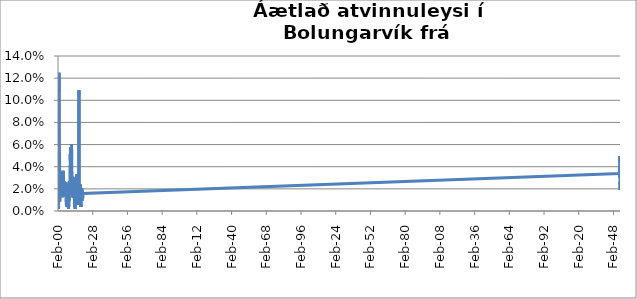
| Category | Series 0 |
|---|---|
| 2000-02-01 | 0.007 |
| 2000-03-01 | 0.009 |
| 2000-04-01 | 0.007 |
| 2000-05-01 | 0.003 |
| 2000-06-01 | 0.003 |
| 2000-07-01 | 0.002 |
| 2000-08-01 | 0.007 |
| 2000-09-01 | 0.012 |
| 2000-10-01 | 0.023 |
| 2000-11-01 | 0.024 |
| 2000-12-01 | 0.125 |
| 2001-01-01 | 0.108 |
| 2001-02-01 | 0.075 |
| 2001-03-01 | 0.054 |
| 2001-04-01 | 0.054 |
| 2001-05-01 | 0.052 |
| 2001-06-01 | 0.021 |
| 2001-07-01 | 0.009 |
| 2001-08-01 | 0.017 |
| 2001-09-01 | 0.017 |
| 2001-10-01 | 0.017 |
| 2001-11-01 | 0.014 |
| 2001-12-01 | 0.014 |
| 2002-01-01 | 0.014 |
| 2002-02-01 | 0.013 |
| 2002-03-01 | 0.014 |
| 2002-04-01 | 0.016 |
| 2002-05-01 | 0.023 |
| 2002-06-01 | 0.016 |
| 2002-07-01 | 0.014 |
| 2002-08-01 | 0.014 |
| 2002-09-01 | 0.018 |
| 2002-10-01 | 0.02 |
| 2002-11-01 | 0.022 |
| 2002-12-01 | 0.031 |
| 2003-01-01 | 0.03 |
| 2003-02-01 | 0.03 |
| 2003-03-01 | 0.025 |
| 2003-04-01 | 0.022 |
| 2003-05-01 | 0.02 |
| 2003-06-01 | 0.02 |
| 2003-07-01 | 0.021 |
| 2003-08-01 | 0.012 |
| 2003-09-01 | 0.028 |
| 2003-10-01 | 0.032 |
| 2003-11-01 | 0.036 |
| 2003-12-01 | 0.028 |
| 2004-01-01 | 0.031 |
| 2004-02-01 | 0.021 |
| 2004-03-01 | 0.036 |
| 2004-04-01 | 0.032 |
| 2004-05-01 | 0.026 |
| 2004-06-01 | 0.034 |
| 2004-07-01 | 0.032 |
| 2004-08-01 | 0.026 |
| 2004-09-01 | 0.021 |
| 2004-10-01 | 0.023 |
| 2004-11-01 | 0.027 |
| 2004-12-01 | 0.017 |
| 2005-01-01 | 0.025 |
| 2005-02-01 | 0.025 |
| 2005-03-01 | 0.019 |
| 2005-04-01 | 0.023 |
| 2005-05-01 | 0.023 |
| 2005-06-01 | 0.015 |
| 2005-07-01 | 0.013 |
| 2005-08-01 | 0.021 |
| 2005-09-01 | 0.022 |
| 2005-10-01 | 0.019 |
| 2005-11-01 | 0.02 |
| 2005-12-01 | 0.018 |
| 2006-01-01 | 0.016 |
| 2006-02-01 | 0.014 |
| 2006-03-01 | 0.018 |
| 2006-04-01 | 0.021 |
| 2006-05-01 | 0.026 |
| 2006-06-01 | 0.019 |
| 2006-07-01 | 0.019 |
| 2006-08-01 | 0.011 |
| 2006-09-01 | 0.007 |
| 2006-10-01 | 0.008 |
| 2006-11-01 | 0.006 |
| 2006-12-01 | 0.006 |
| 2007-01-01 | 0.004 |
| 2007-02-01 | 0.004 |
| 2007-03-01 | 0.012 |
| 2007-04-01 | 0.009 |
| 2007-05-01 | 0.013 |
| 2007-06-01 | 0.008 |
| 2007-07-01 | 0.006 |
| 2007-08-01 | 0.025 |
| 2007-09-01 | 0.017 |
| 2007-10-01 | 0.024 |
| 2007-11-01 | 0.02 |
| 2007-12-01 | 0.014 |
| 2008-01-01 | 0.004 |
| 2008-02-01 | 0.004 |
| 2008-03-01 | 0.012 |
| 2008-04-01 | 0.009 |
| 2008-05-01 | 0.004 |
| 2008-06-01 | 0.004 |
| 2008-07-01 | 0.002 |
| 2008-08-01 | 0.004 |
| 2008-09-01 | 0.006 |
| 2008-10-01 | 0.004 |
| 2008-11-01 | 0.006 |
| 2008-12-01 | 0.009 |
| 2009-01-01 | 0.012 |
| 2009-02-01 | 0.01 |
| 2009-03-01 | 0.019 |
| 2009-04-01 | 0.027 |
| 2009-05-01 | 0.023 |
| 2009-06-01 | 0.018 |
| 2009-07-01 | 0.018 |
| 2009-08-01 | 0.016 |
| 2009-09-01 | 0.023 |
| 2009-10-01 | 0.029 |
| 2009-11-01 | 0.038 |
| 2009-12-01 | 0.047 |
| 2010-01-01 | 0.051 |
| 2010-02-01 | 0.044 |
| 2010-03-01 | 0.046 |
| 2010-04-01 | 0.056 |
| 2010-05-01 | 0.058 |
| 2010-06-01 | 0.044 |
| 2010-07-01 | 0.041 |
| 2010-08-01 | 0.037 |
| 2010-09-01 | 0.035 |
| 2010-10-01 | 0.029 |
| 2010-11-01 | 0.032 |
| 2010-12-01 | 0.06 |
| 2011-01-01 | 0.059 |
| 2011-02-01 | 0.055 |
| 2011-03-01 | 0.053 |
| 2011-04-01 | 0.043 |
| 2011-05-01 | 0.022 |
| 2011-06-01 | 0.02 |
| 2011-07-01 | 0.018 |
| 2011-08-01 | 0.022 |
| 2011-09-01 | 0.014 |
| 2011-10-01 | 0.013 |
| 2011-11-01 | 0.017 |
| 2011-12-01 | 0.027 |
| 2012-01-01 | 0.027 |
| 2012-02-01 | 0.027 |
| 2012-03-01 | 0.031 |
| 2012-04-01 | 0.028 |
| 2012-05-01 | 0.016 |
| 2012-06-01 | 0.012 |
| 2012-07-01 | 0.012 |
| 2012-08-01 | 0.012 |
| 2012-09-01 | 0.019 |
| 2012-10-01 | 0.03 |
| 2012-11-01 | 0.028 |
| 2012-12-01 | 0.026 |
| 2013-01-01 | 0.024 |
| 2013-02-01 | 0.02 |
| 2013-03-01 | 0.018 |
| 2013-04-01 | 0.011 |
| 2013-05-01 | 0.009 |
| 2013-06-01 | 0.006 |
| 2013-07-01 | 0.007 |
| 2013-08-01 | 0.007 |
| 2013-09-01 | 0.004 |
| 2013-10-01 | 0.004 |
| 2013-11-01 | 0.004 |
| 2013-12-01 | 0.002 |
| 2014-01-01 | 0.006 |
| 2014-02-01 | 0.01 |
| 2014-03-01 | 0.014 |
| 2014-04-01 | 0.014 |
| 2014-05-01 | 0.018 |
| 2014-06-01 | 0.016 |
| 2014-07-01 | 0.012 |
| 2014-08-01 | 0.006 |
| 2014-09-01 | 0.012 |
| 2014-10-01 | 0.016 |
| 2014-11-01 | 0.02 |
| 2014-12-01 | 0.021 |
| 2015-01-01 | 0.025 |
| 2015-02-01 | 0.033 |
| 2015-03-01 | 0.033 |
| 2015-04-01 | 0.032 |
| 2015-05-01 | 0.026 |
| 2015-06-01 | 0.023 |
| 2015-07-01 | 0.019 |
| 2015-08-01 | 0.017 |
| 2015-09-01 | 0.011 |
| 2015-10-01 | 0.012 |
| 2015-11-01 | 0.01 |
| 2015-12-01 | 0.012 |
| 2016-01-01 | 0.012 |
| 2016-02-01 | 0.017 |
| 2016-03-01 | 0.019 |
| 2016-04-01 | 0.023 |
| 2016-05-01 | 0.027 |
| 2016-06-01 | 0.013 |
| 2016-07-01 | 0.011 |
| 2016-08-01 | 0.007 |
| 2016-09-01 | 0.009 |
| 2016-10-01 | 0.006 |
| 2016-11-01 | 0.023 |
| 2016-12-01 | 0.096 |
| 2017-01-01 | 0.109 |
| 2017-02-01 | 0.023 |
| 2017-03-01 | 0.017 |
| 2017-04-01 | 0.015 |
| 2017-05-01 | 0.009 |
| 2017-06-01 | 0.009 |
| 2017-07-01 | 0.007 |
| 2017-08-01 | 0.02 |
| 2017-09-01 | 0.016 |
| 2017-10-01 | 0.017 |
| 2017-11-01 | 0.017 |
| 2017-12-01 | 0.015 |
| 2018-01-01 | 0.019 |
| 2018-02-01 | 0.024 |
| 2018-03-01 | 0.024 |
| 2018-04-01 | 0.018 |
| 2018-05-01 | 0.011 |
| 2018-06-01 | 0.007 |
| 2018-07-01 | 0.004 |
| 2018-08-01 | 0.006 |
| 2018-09-01 | 0.004 |
| 2018-10-01 | 0.013 |
| 2018-11-01 | 0.013 |
| 2018-12-01 | 0.013 |
| 2019-01-01 | 0.013 |
| 2019-02-01 | 0.019 |
| 2019-03-01 | 0.017 |
| 2019-04-01 | 0.02 |
| 2019-05-01 | 0.015 |
| 2019-06-01 | 0.013 |
| 2019-07-01 | 0.013 |
| 2019-08-01 | 0.009 |
| 2019-09-01 | 0.013 |
| 2019-10-01 | 0.013 |
| 2019-11-01 | 0.019 |
| 2019-12-01 | 0.013 |
| 2020-01-01 | 0.012 |
| 2020-02-01 | 0.016 |
| 202003.0 | 0.034 |
| 202004.0 | 0.04 |
| 202005.0 | 0.03 |
| 202006.0 | 0.04 |
| 202007.0 | 0.036 |
| 202008.0 | 0.038 |
| 202009.0 | 0.04 |
| 202010.0 | 0.044 |
| 202011.0 | 0.05 |
| 202012.0 | 0.046 |
| 202101.0 | 0.043 |
| 202102.0 | 0.039 |
| 202103.0 | 0.039 |
| 202104.0 | 0.038 |
| 202105.0 | 0.028 |
| 202106.0 | 0.028 |
| 202107.0 | 0.025 |
| 202108.0 | 0.027 |
| 202109.0 | 0.019 |